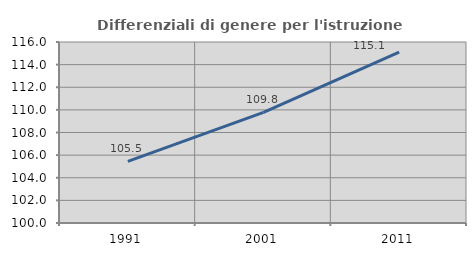
| Category | Differenziali di genere per l'istruzione superiore |
|---|---|
| 1991.0 | 105.452 |
| 2001.0 | 109.781 |
| 2011.0 | 115.097 |